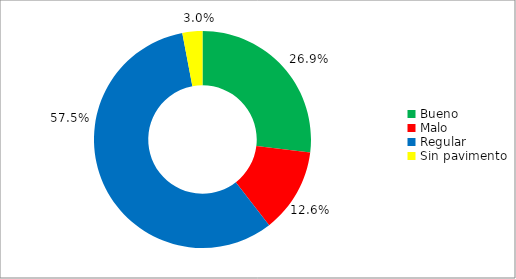
| Category | Series 0 |
|---|---|
| Bueno | 0.269 |
| Malo | 0.126 |
| Regular | 0.575 |
| Sin pavimento | 0.03 |